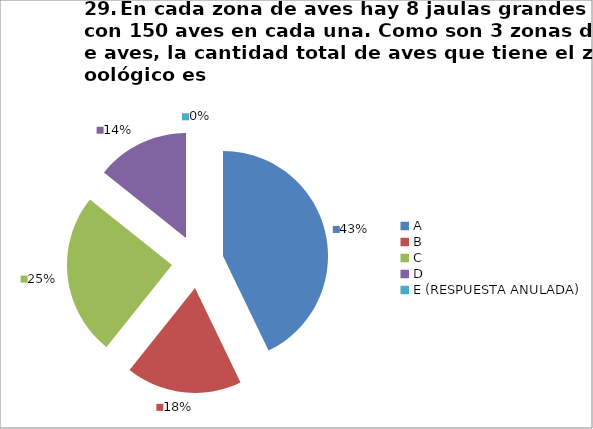
| Category | CANTIDAD DE RESPUESTAS PREGUNTA (29) | PORCENTAJE |
|---|---|---|
| A | 12 | 0.429 |
| B | 5 | 0.179 |
| C | 7 | 0.25 |
| D | 4 | 0.143 |
| E (RESPUESTA ANULADA) | 0 | 0 |